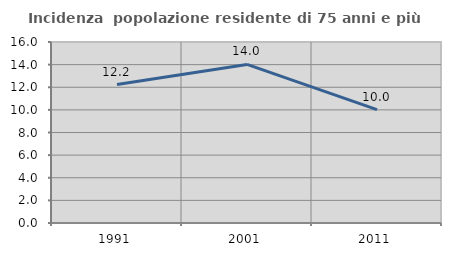
| Category | Incidenza  popolazione residente di 75 anni e più |
|---|---|
| 1991.0 | 12.234 |
| 2001.0 | 14.019 |
| 2011.0 | 10.022 |